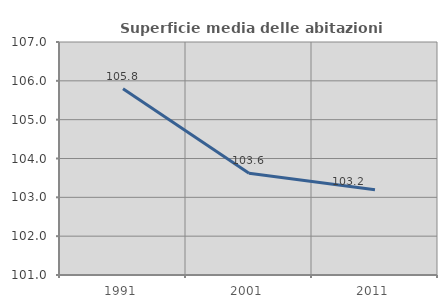
| Category | Superficie media delle abitazioni occupate |
|---|---|
| 1991.0 | 105.795 |
| 2001.0 | 103.62 |
| 2011.0 | 103.197 |